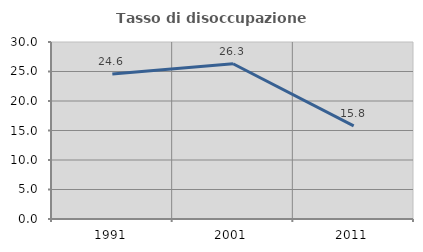
| Category | Tasso di disoccupazione giovanile  |
|---|---|
| 1991.0 | 24.561 |
| 2001.0 | 26.316 |
| 2011.0 | 15.789 |